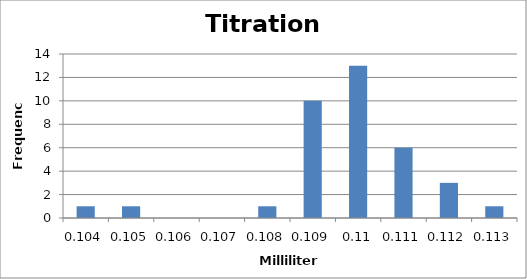
| Category | Series 0 |
|---|---|
| 0.104 | 1 |
| 0.105 | 1 |
| 0.106 | 0 |
| 0.107 | 0 |
| 0.108 | 1 |
| 0.109 | 10 |
| 0.11 | 13 |
| 0.111 | 6 |
| 0.112 | 3 |
| 0.113 | 1 |